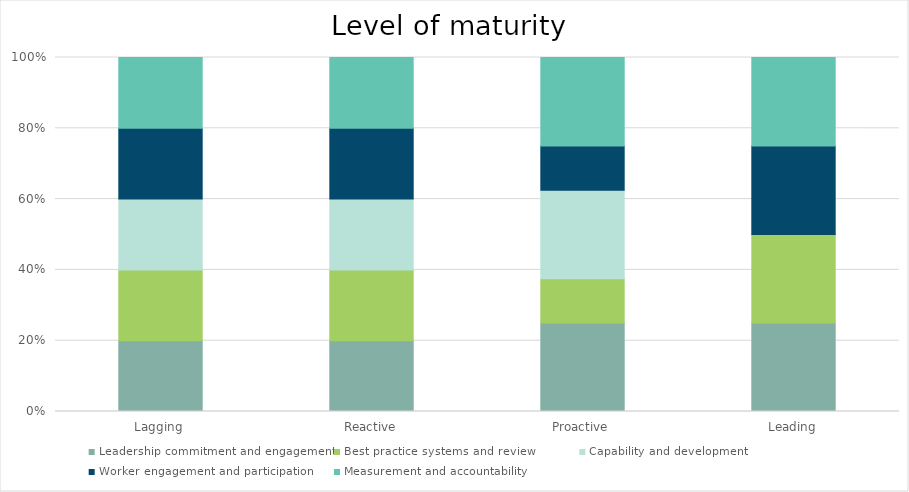
| Category | Leadership commitment and engagement | Best practice systems and review | Capability and development | Worker engagement and participation | Measurement and accountability |
|---|---|---|---|---|---|
| Lagging | 1 | 1 | 1 | 1 | 1 |
| Reactive | 1 | 1 | 1 | 1 | 1 |
| Proactive | 2 | 1 | 2 | 1 | 2 |
| Leading | 1 | 1 | 0 | 1 | 1 |